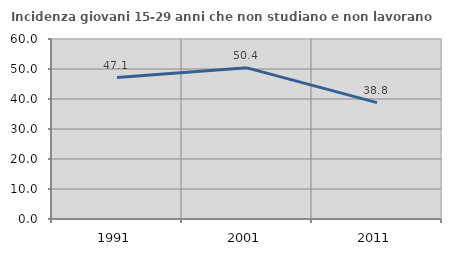
| Category | Incidenza giovani 15-29 anni che non studiano e non lavorano  |
|---|---|
| 1991.0 | 47.137 |
| 2001.0 | 50.382 |
| 2011.0 | 38.776 |